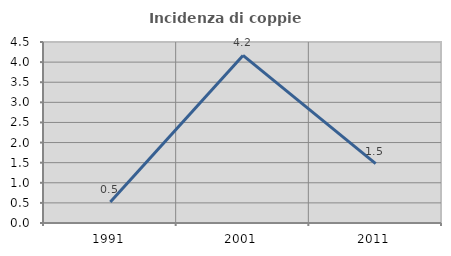
| Category | Incidenza di coppie miste |
|---|---|
| 1991.0 | 0.524 |
| 2001.0 | 4.167 |
| 2011.0 | 1.474 |